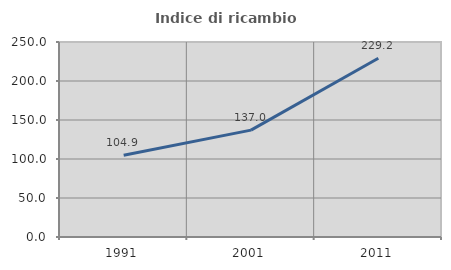
| Category | Indice di ricambio occupazionale  |
|---|---|
| 1991.0 | 104.895 |
| 2001.0 | 137.008 |
| 2011.0 | 229.197 |